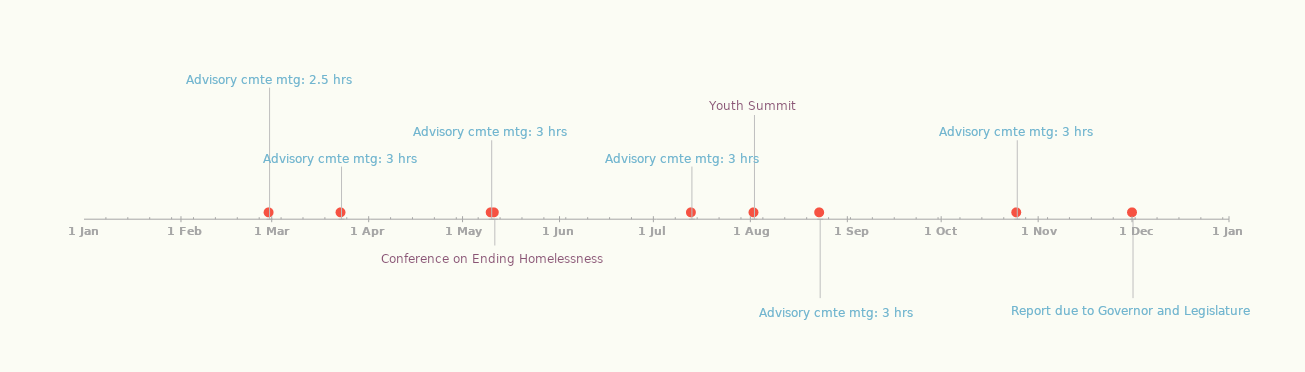
| Category | POSITION |
|---|---|
| Advisory cmte mtg: 2.5 hrs | 25 |
| Advisory cmte mtg: 3 hrs | 10 |
| Advisory cmte mtg: 3 hrs | 15 |
| Conference on Ending Homelessness | -5 |
| Advisory cmte mtg: 3 hrs | 10 |
| Youth Summit | 20 |
| Advisory cmte mtg: 3 hrs | -15 |
| Advisory cmte mtg: 3 hrs | 15 |
| Report due to Governor and Legislature | -15 |